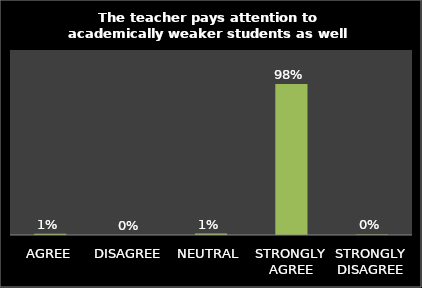
| Category | Series 0 |
|---|---|
| AGREE | 0.008 |
| DISAGREE | 0 |
| NEUTRAL | 0.01 |
| STRONGLY AGREE | 0.979 |
| STRONGLY DISAGREE | 0.004 |